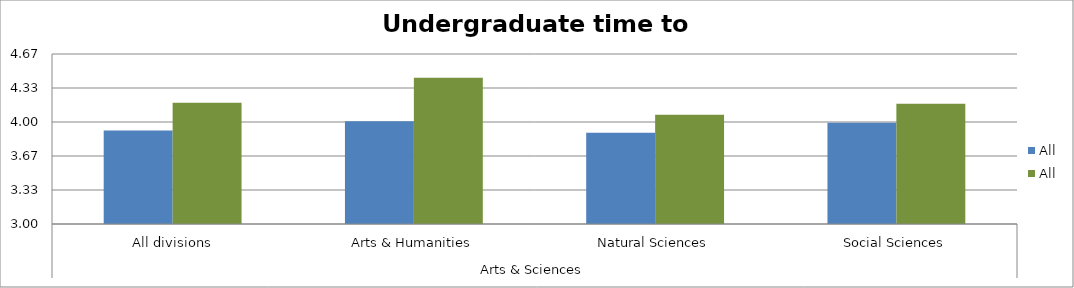
| Category | Peers - Median - All | CU-Boulder - Mean TTD - All |
|---|---|---|
| 0 | 3.916 | 4.188 |
| 1 | 4.007 | 4.433 |
| 2 | 3.894 | 4.071 |
| 3 | 3.992 | 4.179 |